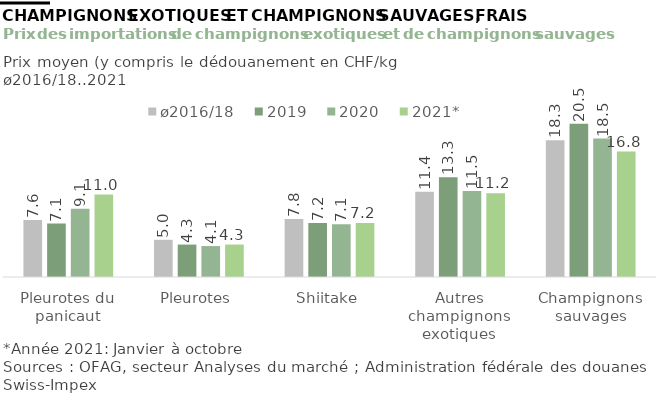
| Category | ø2016/18 | 2019 | 2020 | 2021* |
|---|---|---|---|---|
| Pleurotes du panicaut | 7.637 | 7.138 | 9.128 | 11.024 |
| Pleurotes | 4.974 | 4.334 | 4.136 | 4.342 |
| Shiitake | 7.756 | 7.212 | 7.053 | 7.206 |
| Autres champignons exotiques | 11.408 | 13.336 | 11.481 | 11.187 |
| Champignons sauvages | 18.267 | 20.486 | 18.5 | 16.764 |